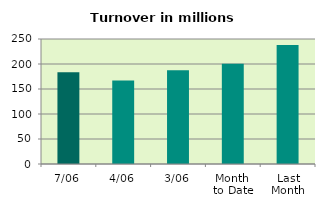
| Category | Series 0 |
|---|---|
| 7/06 | 183.385 |
| 4/06 | 166.896 |
| 3/06 | 187.597 |
| Month 
to Date | 200.677 |
| Last
Month | 237.894 |